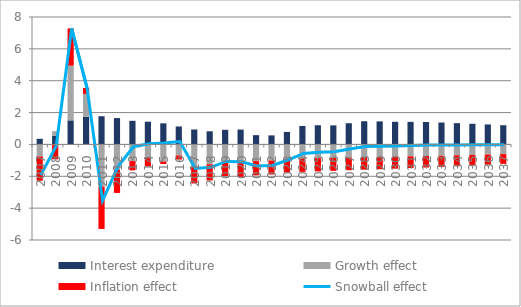
| Category | Interest expenditure | Growth effect | Inflation effect |
|---|---|---|---|
| 0 | 0.353 | -0.754 | -1.527 |
| 1 | 0.551 | 0.285 | -0.933 |
| 2 | 1.511 | 3.434 | 2.337 |
| 3 | 1.731 | 1.442 | 0.368 |
| 4 | 1.77 | -2.65 | -2.655 |
| 5 | 1.655 | -1.594 | -1.45 |
| 6 | 1.483 | -1.047 | -0.579 |
| 7 | 1.428 | -0.798 | -0.585 |
| 8 | 1.324 | -1.075 | -0.157 |
| 9 | 1.127 | -0.694 | -0.255 |
| 10 | 0.938 | -1.39 | -1.06 |
| 11 | 0.825 | -1.245 | -1.018 |
| 12 | 0.918 | -1.135 | -0.853 |
| 13 | 0.933 | -1.17 | -0.858 |
| 14 | 0.582 | -1.048 | -0.89 |
| 15 | 0.569 | -1.014 | -0.872 |
| 16 | 0.785 | -0.91 | -0.854 |
| 17 | 1.158 | -0.884 | -0.839 |
| 18 | 1.206 | -0.863 | -0.832 |
| 19 | 1.195 | -0.843 | -0.815 |
| 20 | 1.332 | -0.822 | -0.797 |
| 21 | 1.457 | -0.803 | -0.781 |
| 22 | 1.445 | -0.787 | -0.768 |
| 23 | 1.421 | -0.769 | -0.753 |
| 24 | 1.417 | -0.75 | -0.736 |
| 25 | 1.408 | -0.73 | -0.718 |
| 26 | 1.374 | -0.708 | -0.7 |
| 27 | 1.335 | -0.686 | -0.68 |
| 28 | 1.297 | -0.662 | -0.658 |
| 29 | 1.255 | -0.636 | -0.634 |
| 30 | 1.206 | -0.609 | -0.609 |